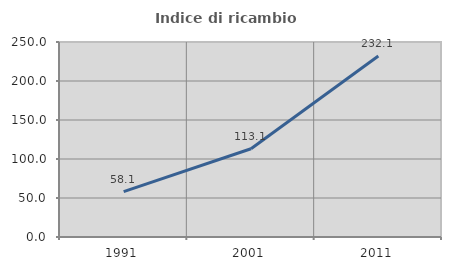
| Category | Indice di ricambio occupazionale  |
|---|---|
| 1991.0 | 58.147 |
| 2001.0 | 113.082 |
| 2011.0 | 232.12 |